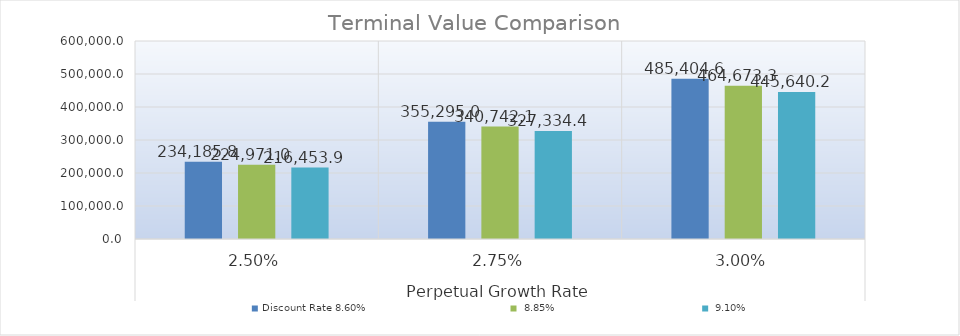
| Category | Discount Rate |
|---|---|
| 0 | 216453.867 |
| 1 | 327334.433 |
| 2 | 445640.237 |